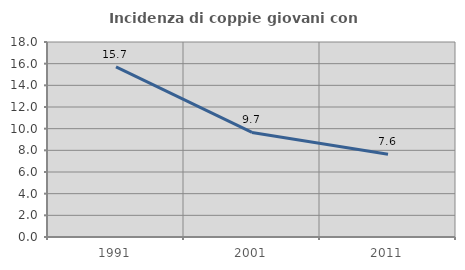
| Category | Incidenza di coppie giovani con figli |
|---|---|
| 1991.0 | 15.698 |
| 2001.0 | 9.655 |
| 2011.0 | 7.634 |